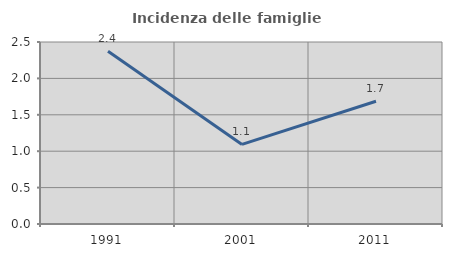
| Category | Incidenza delle famiglie numerose |
|---|---|
| 1991.0 | 2.373 |
| 2001.0 | 1.093 |
| 2011.0 | 1.687 |